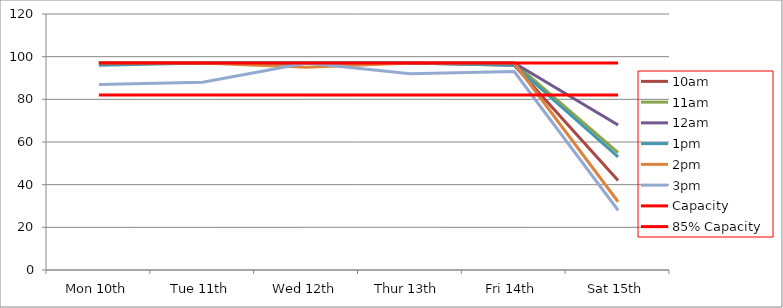
| Category | 9am | 10am | 11am | 12am | 1pm | 2pm | 3pm | 4pm | 5pm | Capacity | 85% Capacity |
|---|---|---|---|---|---|---|---|---|---|---|---|
| Mon 10th |  | 97 | 97 | 97 | 96 | 97 | 87 |  |  | 97 | 82 |
| Tue 11th |  | 97 | 97 | 97 | 97 | 97 | 88 |  |  | 97 | 82 |
| Wed 12th |  | 97 | 97 | 97 | 97 | 95 | 97 |  |  | 97 | 82 |
| Thur 13th |  | 97 | 97 | 97 | 97 | 97 | 92 |  |  | 97 | 82 |
| Fri 14th |  | 96 | 97 | 97 | 96 | 97 | 93 |  |  | 97 | 82 |
| Sat 15th |  | 42 | 55 | 68 | 53 | 32 | 28 |  |  | 97 | 82 |